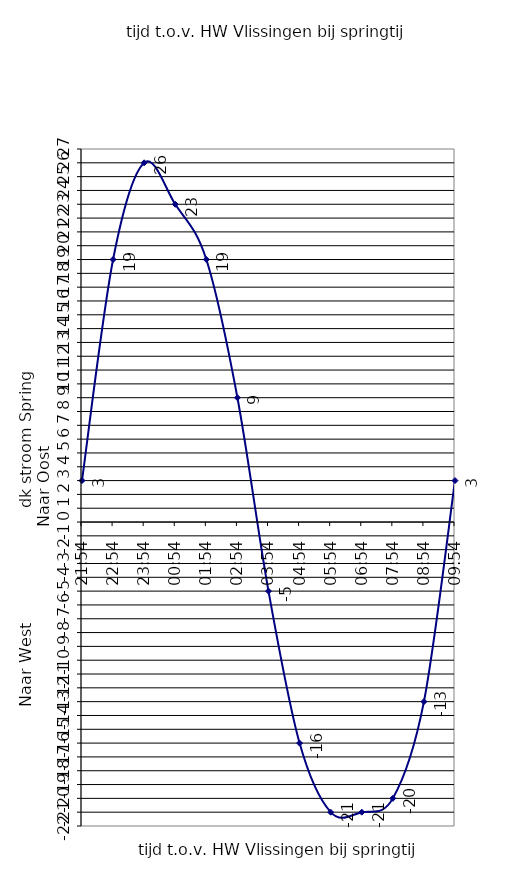
| Category | Series 0 |
|---|---|
| 21:54 | 3 |
| 22:54 | 19 |
| 23:54 | 26 |
| 00:54 | 23 |
| 01:54 | 19 |
| 02:54 | 9 |
| 0.1625 | -5 |
| 04:54 | -16 |
| 05:54 | -21 |
| 06:54 | -21 |
| 07:54 | -20 |
| 08:54 | -13 |
| 09:54 | 3 |